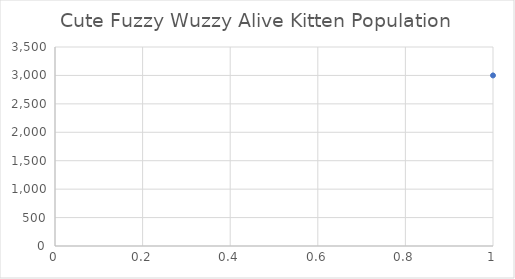
| Category | Series 0 |
|---|---|
| 0 | 3000 |
| 1 | 2999.9 |
| 2 | 2999.77 |
| 3 | 2999.601 |
| 4 | 2999.381 |
| 5 | 2999.096 |
| 6 | 2998.724 |
| 7 | 2998.242 |
| 8 | 2997.614 |
| 9 | 2996.799 |
| 10 | 2995.738 |
| 11 | 2994.359 |
| 12 | 2992.567 |
| 13 | 2990.237 |
| 14 | 2987.209 |
| 15 | 2983.271 |
| 16 | 2978.153 |
| 17 | 2971.499 |
| 18 | 2962.848 |
| 19 | 2951.603 |
| 20 | 2936.983 |
| 21 | 2917.978 |
| 22 | 2893.272 |
| 23 | 2861.154 |
| 24 | 2819.4 |
| 25 | 2765.12 |
| 26 | 2694.556 |
| 27 | 2602.822 |
| 28 | 2483.569 |
| 29 | 2328.54 |
| 30 | 2127.001 |
| 31 | 1865.002 |